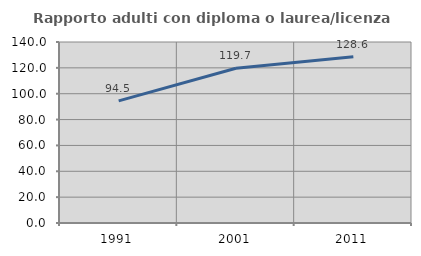
| Category | Rapporto adulti con diploma o laurea/licenza media  |
|---|---|
| 1991.0 | 94.493 |
| 2001.0 | 119.726 |
| 2011.0 | 128.611 |